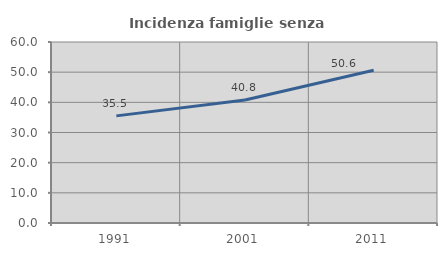
| Category | Incidenza famiglie senza nuclei |
|---|---|
| 1991.0 | 35.514 |
| 2001.0 | 40.753 |
| 2011.0 | 50.62 |